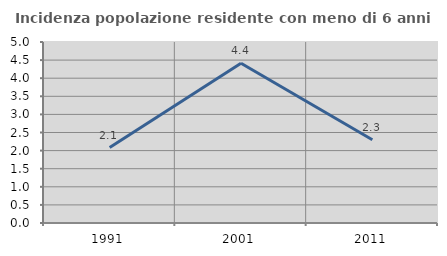
| Category | Incidenza popolazione residente con meno di 6 anni |
|---|---|
| 1991.0 | 2.083 |
| 2001.0 | 4.412 |
| 2011.0 | 2.299 |